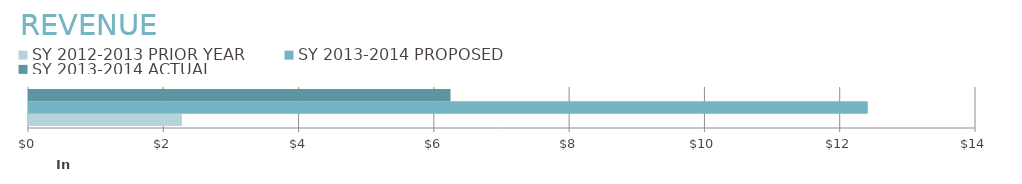
| Category | SY 2012-2013 | SY 2013-2014 |
|---|---|---|
| 0 | 2260 | 6231.5 |